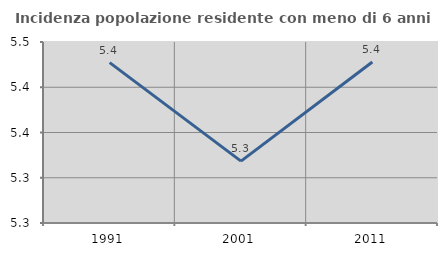
| Category | Incidenza popolazione residente con meno di 6 anni |
|---|---|
| 1991.0 | 5.427 |
| 2001.0 | 5.318 |
| 2011.0 | 5.428 |